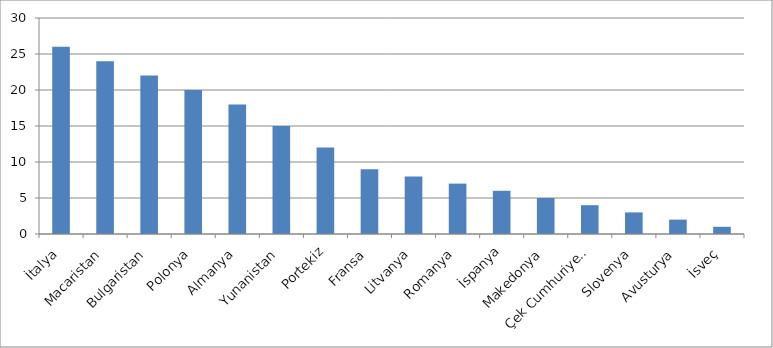
| Category | Series 0 |
|---|---|
| İtalya | 26 |
| Macaristan | 24 |
| Bulgaristan | 22 |
| Polonya | 20 |
| Almanya | 18 |
| Yunanistan | 15 |
| Portekiz | 12 |
| Fransa | 9 |
| Litvanya | 8 |
| Romanya | 7 |
| İspanya | 6 |
| Makedonya | 5 |
| Çek Cumhuriyeti | 4 |
| Slovenya | 3 |
| Avusturya | 2 |
| İsveç | 1 |